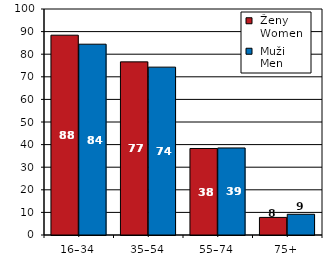
| Category |  Ženy 
 Women |  Muži 
 Men |
|---|---|---|
| 16–34 | 88.41 | 84.43 |
| 35–54 | 76.61 | 74.28 |
| 55–74 | 38.28 | 38.51 |
| 75+ | 7.78 | 9.17 |